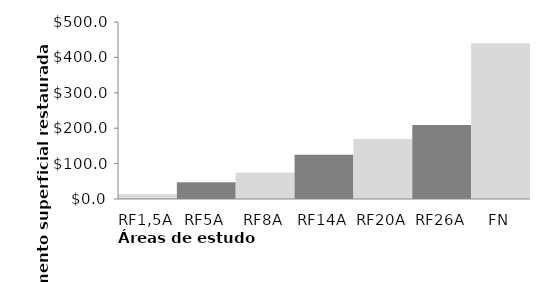
| Category | Series 0 |
|---|---|
| RF1,5A | 13.47 |
| RF5A | 47.145 |
| RF8A | 74.697 |
| RF14A | 124.904 |
| RF20A | 169.6 |
| RF26A | 208.785 |
| FN | 440.224 |